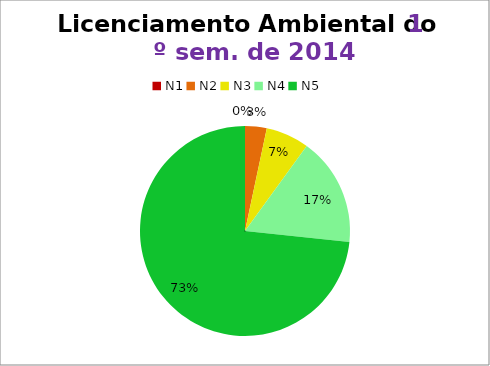
| Category | 1º/14 |
|---|---|
| N1 | 0 |
| N2 | 1 |
| N3 | 2 |
| N4 | 5 |
| N5 | 22 |